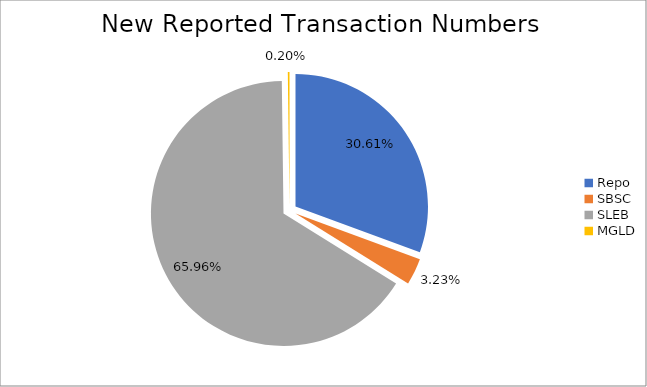
| Category | Series 0 |
|---|---|
| Repo | 404871 |
| SBSC | 42784 |
| SLEB | 872465 |
| MGLD | 2697 |